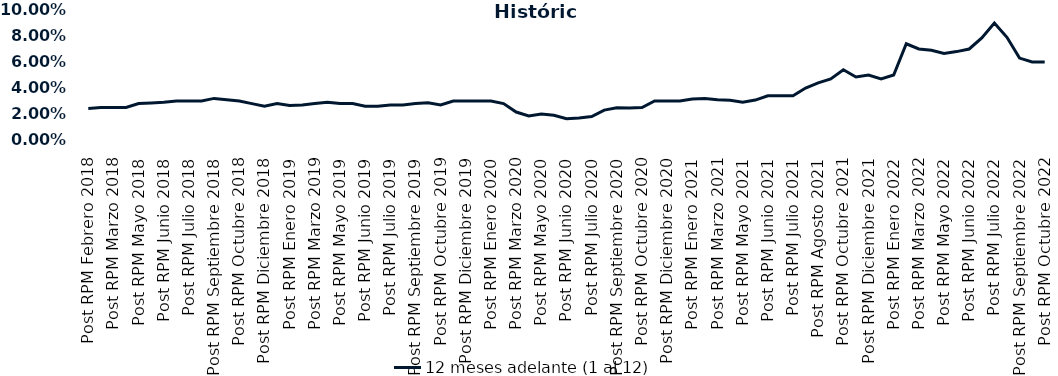
| Category | 12 meses adelante (1 al 12)  |
|---|---|
| Post RPM Febrero 2018 | 0.024 |
| Pre RPM Marzo 2018 | 0.025 |
| Post RPM Marzo 2018 | 0.025 |
| Pre RPM Mayo 2018 | 0.025 |
| Post RPM Mayo 2018 | 0.028 |
| Pre RPM Junio 2018 | 0.028 |
| Post RPM Junio 2018 | 0.029 |
| Pre RPM Julio 2018 | 0.03 |
| Post RPM Julio 2018 | 0.03 |
| Pre RPM Septiembre 2018 | 0.03 |
| Post RPM Septiembre 2018 | 0.032 |
| Pre RPM Octubre 2018 | 0.031 |
| Post RPM Octubre 2018 | 0.03 |
| Pre RPM Diciembre 2018 | 0.028 |
| Post RPM Diciembre 2018 | 0.026 |
| Pre RPM Enero 2019 | 0.028 |
| Post RPM Enero 2019 | 0.026 |
| Pre RPM Marzo 2019 | 0.027 |
| Post RPM Marzo 2019 | 0.028 |
| Pre RPM Mayo 2019 | 0.029 |
| Post RPM Mayo 2019 | 0.028 |
| Pre RPM Junio 2019 | 0.028 |
| Post RPM Junio 2019 | 0.026 |
| Pre RPM Julio 2019 | 0.026 |
| Post RPM Julio 2019 | 0.027 |
| Pre RPM Septiembre 2019 | 0.027 |
| Post RPM Septiembre 2019 | 0.028 |
| Pre RPM Octubre 2019 | 0.029 |
| Post RPM Octubre 2019 | 0.027 |
| Pre RPM Diciembre 2019 | 0.03 |
| Post RPM Diciembre 2019 | 0.03 |
| Pre RPM Enero 2020 | 0.03 |
| Post RPM Enero 2020 | 0.03 |
| Pre RPM Marzo 2020 | 0.028 |
| Post RPM Marzo 2020 | 0.022 |
| Pre RPM Mayo 2020 | 0.018 |
| Post RPM Mayo 2020 | 0.02 |
| Pre RPM Junio 2020 | 0.019 |
| Post RPM Junio 2020 | 0.016 |
| Pre RPM Julio 2020 | 0.017 |
| Post RPM Julio 2020 | 0.018 |
| Pre RPM Septiembre 2020 | 0.023 |
| Post RPM Septiembre 2020 | 0.025 |
| Pre RPM Octubre 2020 | 0.025 |
| Post RPM Octubre 2020 | 0.025 |
| Pre RPM Diciembre 2020 | 0.03 |
| Post RPM Diciembre 2020 | 0.03 |
| Pre RPM Enero 2021 | 0.03 |
| Post RPM Enero 2021 | 0.032 |
| Pre RPM Marzo 2021 | 0.032 |
| Post RPM Marzo 2021 | 0.031 |
| Pre RPM Mayo 2021 | 0.03 |
| Post RPM Mayo 2021 | 0.029 |
| Pre RPM Junio 2021 | 0.031 |
| Post RPM Junio 2021 | 0.034 |
| Pre RPM Julio 2021 | 0.034 |
| Post RPM Julio 2021 | 0.034 |
| Pre RPM Agosto 2021 | 0.04 |
| Post RPM Agosto 2021 | 0.044 |
| Pre RPM Octubre 2021 | 0.047 |
| Post RPM Octubre 2021 | 0.054 |
| Pre RPM Diciembre 2021 | 0.048 |
| Post RPM Diciembre 2021 | 0.05 |
| Pre RPM Enero 2022 | 0.047 |
| Post RPM Enero 2022 | 0.05 |
| Pre RPM Marzo 2022 | 0.074 |
| Post RPM Marzo 2022 | 0.07 |
| Pre RPM Mayo 2022 | 0.069 |
| Post RPM Mayo 2022 | 0.066 |
| Pre RPM Junio 2022 | 0.068 |
| Post RPM Junio 2022 | 0.07 |
| Pre RPM Julio 2022 | 0.078 |
| Post RPM Julio 2022 | 0.09 |
| Pre RPM Septiembre 2022 | 0.079 |
| Post RPM Septiembre 2022 | 0.063 |
| Pre RPM Octubre 2022 | 0.06 |
| Post RPM Octubre 2022 | 0.06 |